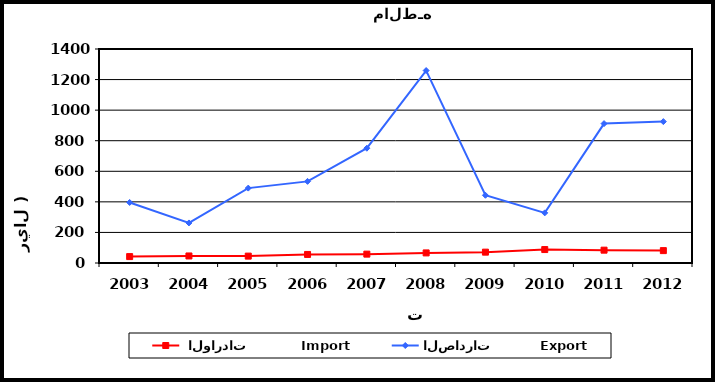
| Category |  الواردات           Import | الصادرات          Export |
|---|---|---|
| 2003.0 | 42 | 396 |
| 2004.0 | 46 | 262 |
| 2005.0 | 45 | 490 |
| 2006.0 | 56 | 534 |
| 2007.0 | 58 | 751 |
| 2008.0 | 66 | 1259 |
| 2009.0 | 71 | 443 |
| 2010.0 | 88 | 328 |
| 2011.0 | 84 | 912 |
| 2012.0 | 81 | 925 |